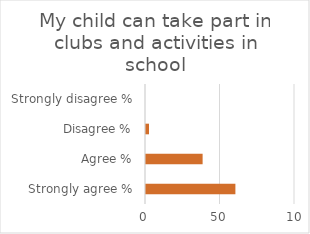
| Category | Series 1 |
|---|---|
| Strongly agree % | 60 |
| Agree % | 38 |
| Disagree % | 2 |
| Strongly disagree % | 0 |